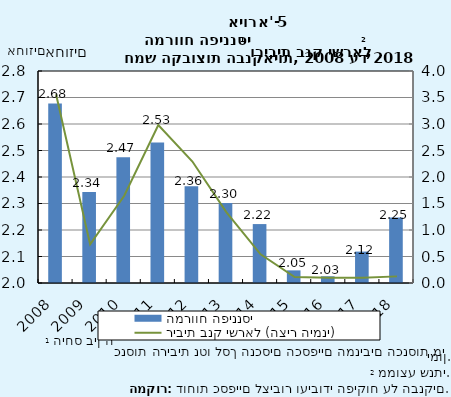
| Category | המרווח הפיננסי |
|---|---|
| 2008.0 | 2.677 |
| 2009.0 | 2.343 |
| 2010.0 | 2.475 |
| 2011.0 | 2.53 |
| 2012.0 | 2.365 |
| 2013.0 | 2.302 |
| 2014.0 | 2.222 |
| 2015.0 | 2.048 |
| 2016.0 | 2.025 |
| 2017.0 | 2.118 |
| 2018.0 | 2.247 |